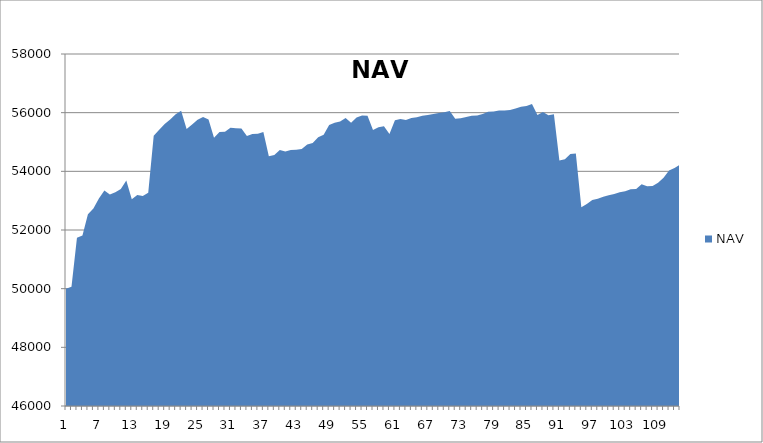
| Category | NAV |
|---|---|
| 0 | 50000 |
| 1 | 50069.444 |
| 2 | 51736.444 |
| 3 | 51809.343 |
| 4 | 52539.343 |
| 5 | 52733.57 |
| 6 | 53070.527 |
| 7 | 53346.212 |
| 8 | 53210.13 |
| 9 | 53285.788 |
| 10 | 53396.685 |
| 11 | 53684.185 |
| 12 | 53050.597 |
| 13 | 53191.058 |
| 14 | 53162.649 |
| 15 | 53270.317 |
| 16 | 55214.762 |
| 17 | 55418.583 |
| 18 | 55617.273 |
| 19 | 55770.477 |
| 20 | 55945.477 |
| 21 | 56069.601 |
| 22 | 55444.601 |
| 23 | 55597.925 |
| 24 | 55757.558 |
| 25 | 55851.308 |
| 26 | 55764.06 |
| 27 | 55148.361 |
| 28 | 55340.028 |
| 29 | 55349.317 |
| 30 | 55485.393 |
| 31 | 55468.704 |
| 32 | 55461.038 |
| 33 | 55205.356 |
| 34 | 55270.356 |
| 35 | 55282.57 |
| 36 | 55341.011 |
| 37 | 54517.482 |
| 38 | 54554.291 |
| 39 | 54731.016 |
| 40 | 54679.093 |
| 41 | 54730.595 |
| 42 | 54736.73 |
| 43 | 54765.085 |
| 44 | 54915.643 |
| 45 | 54969.86 |
| 46 | 55164.665 |
| 47 | 55247.746 |
| 48 | 55575.668 |
| 49 | 55657.905 |
| 50 | 55701.032 |
| 51 | 55819.28 |
| 52 | 55652.834 |
| 53 | 55838.604 |
| 54 | 55905.769 |
| 55 | 55898.888 |
| 56 | 55410.9 |
| 57 | 55504.564 |
| 58 | 55537.603 |
| 59 | 55268.471 |
| 60 | 55737.858 |
| 61 | 55785.708 |
| 62 | 55749.829 |
| 63 | 55815.591 |
| 64 | 55842.34 |
| 65 | 55894.021 |
| 66 | 55916.828 |
| 67 | 55955.697 |
| 68 | 55991.896 |
| 69 | 56012.065 |
| 70 | 56060.293 |
| 71 | 55791.443 |
| 72 | 55810.674 |
| 73 | 55852.843 |
| 74 | 55892.018 |
| 75 | 55900.069 |
| 76 | 55955.739 |
| 77 | 56030.918 |
| 78 | 56036.168 |
| 79 | 56069.975 |
| 80 | 56071.656 |
| 81 | 56090.406 |
| 82 | 56141.798 |
| 83 | 56199.159 |
| 84 | 56228.237 |
| 85 | 56292.573 |
| 86 | 55924.369 |
| 87 | 56019.106 |
| 88 | 55916.165 |
| 89 | 55950.09 |
| 90 | 54367.13 |
| 91 | 54411.811 |
| 92 | 54588.933 |
| 93 | 54611.197 |
| 94 | 52777.117 |
| 95 | 52883.107 |
| 96 | 53025.651 |
| 97 | 53064.908 |
| 98 | 53135.652 |
| 99 | 53186.005 |
| 100 | 53229.789 |
| 101 | 53290.192 |
| 102 | 53319.038 |
| 103 | 53392.112 |
| 104 | 53401.462 |
| 105 | 53559.878 |
| 106 | 53489.526 |
| 107 | 53501.684 |
| 108 | 53607.597 |
| 109 | 53785.178 |
| 110 | 54030.211 |
| 111 | 54113.452 |
| 112 | 54226.272 |